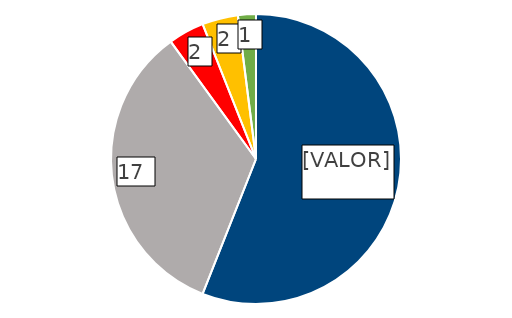
| Category | 2023 |
|---|---|
| E-mail a Transparencia CORREOS | 28 |
| Portal Transparencia AGE | 17 |
| Registro general CORREOS | 2 |
| Correo Postal a Transparencia CORREOS | 2 |
| Otros | 1 |